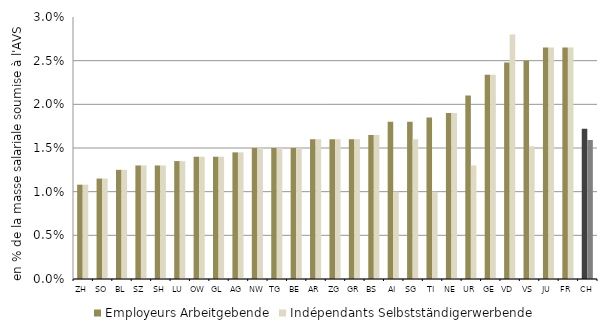
| Category | Employeurs | Indépendants |
|---|---|---|
| ZH | 0.011 | 0.011 |
| SO | 0.012 | 0.012 |
| BL | 0.012 | 0.012 |
| SZ | 0.013 | 0.013 |
| SH | 0.013 | 0.013 |
| LU | 0.014 | 0.014 |
| OW | 0.014 | 0.014 |
| GL | 0.014 | 0.014 |
| AG | 0.014 | 0.014 |
| NW | 0.015 | 0.015 |
| TG | 0.015 | 0.015 |
| BE | 0.015 | 0.015 |
| AR | 0.016 | 0.016 |
| ZG | 0.016 | 0.016 |
| GR | 0.016 | 0.016 |
| BS | 0.016 | 0.016 |
| AI | 0.018 | 0.01 |
| SG | 0.018 | 0.016 |
| TI | 0.018 | 0.01 |
| NE | 0.019 | 0.019 |
| UR | 0.021 | 0.013 |
| GE | 0.023 | 0.023 |
| VD   | 0.025 | 0.028 |
| VS | 0.025 | 0.015 |
| JU | 0.026 | 0.026 |
| FR | 0.026 | 0.026 |
| CH | 0.017 | 0.016 |